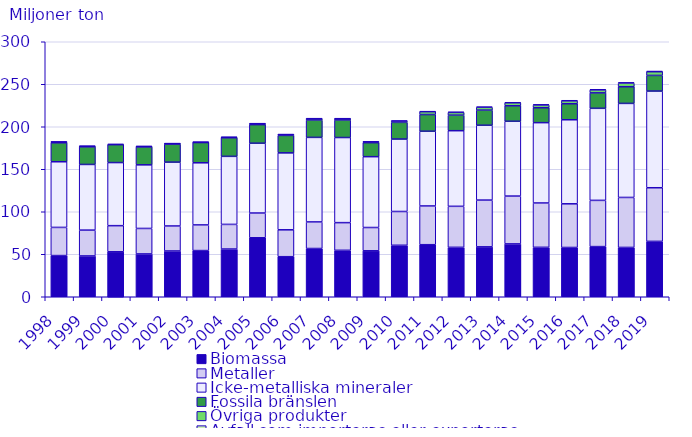
| Category | Biomassa | Metaller | Icke-metalliska mineraler | Fossila bränslen | Övriga produkter | Avfall som importeras eller exporteras |
|---|---|---|---|---|---|---|
| 1998.0 | 48.45 | 33.124 | 77.234 | 22.307 | 1.083 | 0 |
| 1999.0 | 48.012 | 30.373 | 77.263 | 20.74 | 0.784 | 0 |
| 2000.0 | 52.89 | 30.749 | 74.22 | 21.066 | 0.882 | 0 |
| 2001.0 | 50.374 | 29.982 | 74.843 | 21.147 | 0.553 | 0 |
| 2002.0 | 53.847 | 29.421 | 75.081 | 21.298 | 0.531 | 0.002 |
| 2003.0 | 54.338 | 30.173 | 73.097 | 23.796 | 0.472 | 0.002 |
| 2004.0 | 56.123 | 28.995 | 80.051 | 21.838 | 0.702 | 0.002 |
| 2005.0 | 69.39 | 29.115 | 82.129 | 21.876 | 1.108 | 0.017 |
| 2006.0 | 47.128 | 31.629 | 90.495 | 20.558 | 1.006 | 0.008 |
| 2007.0 | 56.754 | 31.276 | 99.466 | 20.378 | 1.629 | 0.013 |
| 2008.0 | 54.647 | 32.553 | 100.126 | 20.614 | 1.537 | 0.027 |
| 2009.0 | 54.056 | 27.403 | 83.328 | 16.476 | 1.024 | 0.156 |
| 2010.0 | 60.555 | 39.747 | 85.219 | 19.63 | 1.573 | 0.29 |
| 2011.0 | 61.242 | 45.578 | 87.908 | 19.643 | 3.384 | 0.46 |
| 2012.0 | 58.132 | 48.252 | 88.97 | 18.269 | 3.263 | 0.534 |
| 2013.0 | 58.707 | 55.01 | 88.057 | 17.798 | 3.334 | 0.56 |
| 2014.0 | 62.179 | 56.273 | 88.018 | 18.189 | 3.507 | 0.667 |
| 2015.0 | 58.158 | 52.17 | 94.499 | 17.548 | 3.187 | 0.671 |
| 2016.0 | 57.97 | 51.378 | 98.879 | 18.861 | 3.379 | 0.712 |
| 2017.0 | 58.993 | 54.402 | 108.309 | 18.144 | 3.511 | 0.756 |
| 2018.0 | 58.033 | 58.791 | 110.646 | 19.639 | 4.279 | 0.736 |
| 2019.0 | 65.158 | 63.088 | 113.728 | 18.422 | 4.357 | 0.773 |